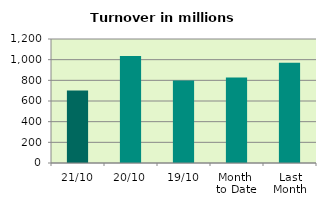
| Category | Series 0 |
|---|---|
| 21/10 | 701.29 |
| 20/10 | 1035.389 |
| 19/10 | 799.241 |
| Month 
to Date | 827.882 |
| Last
Month | 970.98 |